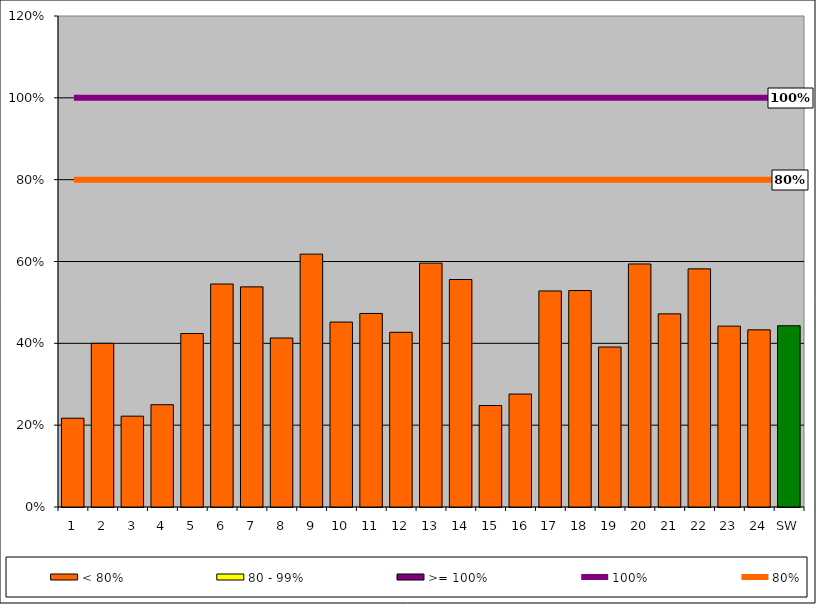
| Category | < 80% | 80 - 99% | >= 100% |
|---|---|---|---|
| 1 | 0.217 | 0 | 0 |
| 2 | 0.4 | 0 | 0 |
| 3 | 0.222 | 0 | 0 |
| 4 | 0.25 | 0 | 0 |
| 5 | 0.424 | 0 | 0 |
| 6 | 0.545 | 0 | 0 |
| 7 | 0.538 | 0 | 0 |
| 8 | 0.413 | 0 | 0 |
| 9 | 0.618 | 0 | 0 |
| 10 | 0.452 | 0 | 0 |
| 11 | 0.473 | 0 | 0 |
| 12 | 0.427 | 0 | 0 |
| 13 | 0.596 | 0 | 0 |
| 14 | 0.556 | 0 | 0 |
| 15 | 0.248 | 0 | 0 |
| 16 | 0.276 | 0 | 0 |
| 17 | 0.528 | 0 | 0 |
| 18 | 0.529 | 0 | 0 |
| 19 | 0.391 | 0 | 0 |
| 20 | 0.594 | 0 | 0 |
| 21 | 0.472 | 0 | 0 |
| 22 | 0.582 | 0 | 0 |
| 23 | 0.442 | 0 | 0 |
| 24 | 0.433 | 0 | 0 |
| SW | 0.443 | 0 | 0 |